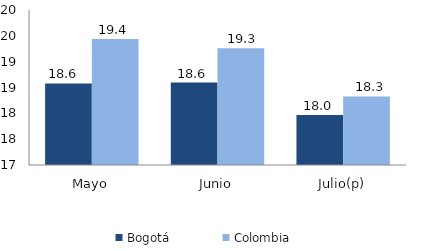
| Category | Bogotá | Colombia |
|---|---|---|
| Mayo | 18.579 | 19.441 |
| Junio | 18.595 | 19.26 |
| Julio(p) | 17.965 | 18.327 |